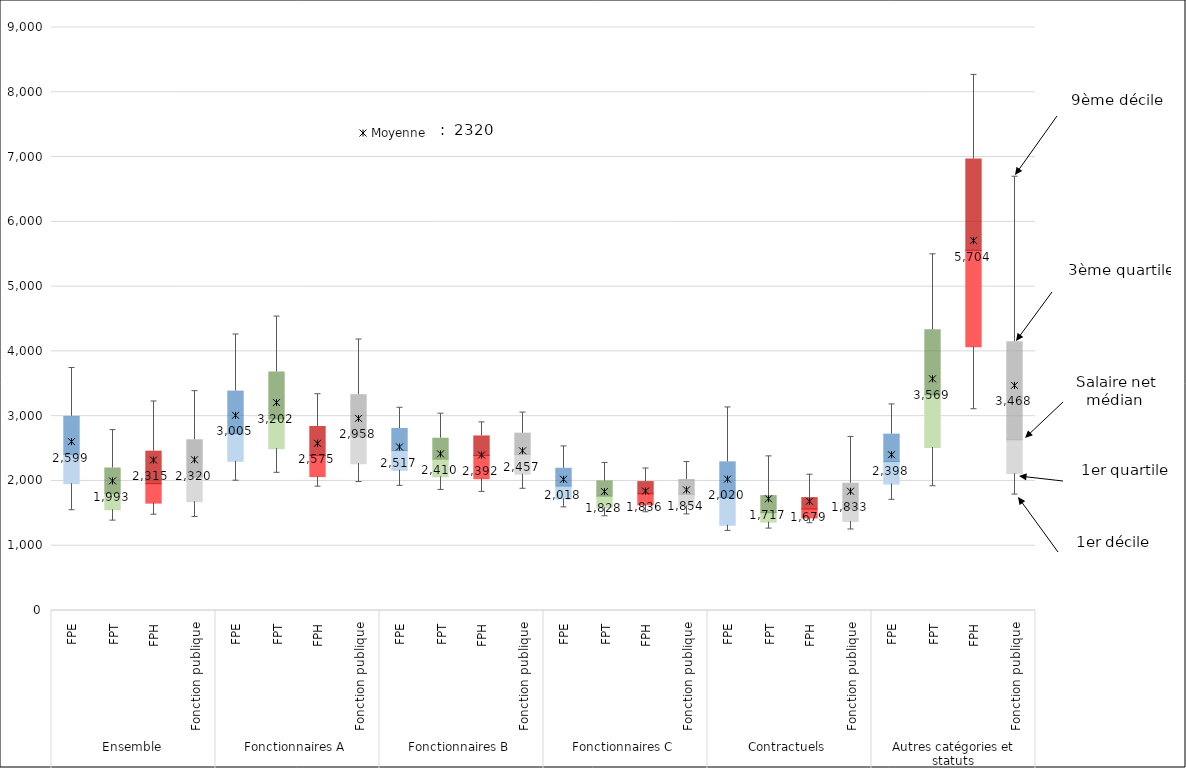
| Category | Series 0 | Series 1 | Series 2 | Series 3 | Series 4 |
|---|---|---|---|---|---|
| 0 | 1547.67 | 410.26 | 448.09 | 591.31 | 746.46 |
| 1 | 1387.32 | 168.76 | 251.34 | 392.25 | 585.18 |
| 2 | 1479 | 178.49 | 299.93 | 502.75 | 766.8 |
| 3 | 1442.71 | 236.29 | 382.33 | 574.34 | 750 |
| 4 | 2003.67 | 299.66 | 428.17 | 656 | 873.17 |
| 5 | 2125.75 | 372 | 462.67 | 722.16 | 854.5 |
| 6 | 1912.17 | 154.62 | 326.62 | 447.84 | 497.5 |
| 7 | 1983.06 | 282.19 | 431.11 | 636.1 | 851.29 |
| 8 | 1924.5 | 239.58 | 305.74 | 340.35 | 319.08 |
| 9 | 1861.33 | 203.25 | 272.5 | 322.59 | 378.66 |
| 10 | 1831.33 | 202.75 | 360 | 300.67 | 209 |
| 11 | 1879.02 | 225.73 | 307.75 | 324.92 | 318.06 |
| 12 | 1591.83 | 129.34 | 200.08 | 274.69 | 337.3 |
| 13 | 1454.83 | 130.84 | 180.91 | 233 | 278.52 |
| 14 | 1516.67 | 114.83 | 170.67 | 188.4 | 201.1 |
| 15 | 1483.52 | 128.9 | 181.64 | 228.35 | 268.92 |
| 16 | 1228.48 | 87.44 | 427.75 | 551.32 | 839.34 |
| 17 | 1264.31 | 99.61 | 145.4 | 264.6 | 605.49 |
| 18 | 1347.5 | 81 | 138.25 | 175.5 | 353.92 |
| 19 | 1250.71 | 123.87 | 200 | 390.28 | 714.3 |
| 20 | 1708.67 | 243.5 | 346.68 | 424.15 | 458.25 |
| 21 | 1918.33 | 597.5 | 813.17 | 1004.25 | 1165.33 |
| 22 | 3107.18 | 963.57 | 1492.23 | 1405.77 | 1299.5 |
| 23 | 1789.77 | 323.44 | 522.46 | 1512.41 | 2548.34 |